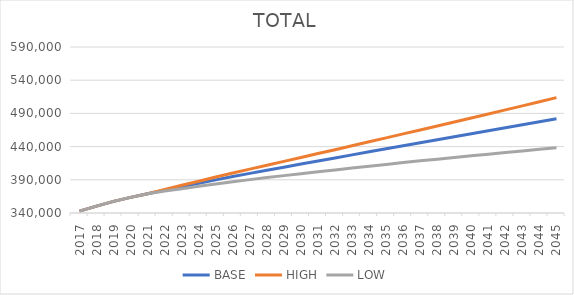
| Category | BASE | HIGH | LOW |
|---|---|---|---|
| 2017.0 | 342817 | 342817 | 342817 |
| 2018.0 | 350430.606 | 350430.606 | 350430.606 |
| 2019.0 | 357512.75 | 357512.75 | 357512.75 |
| 2020.0 | 363512.583 | 363512.583 | 363512.583 |
| 2021.0 | 369033.083 | 369033.083 | 369033.083 |
| 2022.0 | 374436.506 | 375375.352 | 373026.07 |
| 2023.0 | 379632.648 | 381695.858 | 376546.709 |
| 2024.0 | 384800.26 | 387900.744 | 380183.771 |
| 2025.0 | 389922.298 | 394092.029 | 383741.098 |
| 2026.0 | 394925.685 | 400195.278 | 387147.224 |
| 2027.0 | 399676.173 | 406072.957 | 390272.902 |
| 2028.0 | 404364.526 | 411917.847 | 393306.525 |
| 2029.0 | 409025.542 | 417764.901 | 396282.991 |
| 2030.0 | 413651.746 | 423606.247 | 399195.983 |
| 2031.0 | 418277.776 | 429478.027 | 402078.351 |
| 2032.0 | 422901.224 | 435377.965 | 404927.626 |
| 2033.0 | 427508.217 | 441291.797 | 407731.818 |
| 2034.0 | 432104.36 | 447225.663 | 410496.224 |
| 2035.0 | 436681.113 | 453170.724 | 413212.725 |
| 2036.0 | 441247.435 | 459136.302 | 415890.237 |
| 2037.0 | 445798.141 | 465117.142 | 418524.176 |
| 2038.0 | 450331.295 | 471111.256 | 421113.177 |
| 2039.0 | 454854.304 | 477126.651 | 423664.293 |
| 2040.0 | 459353.053 | 483148.037 | 426165.21 |
| 2041.0 | 463843.356 | 489192.639 | 428630.47 |
| 2042.0 | 468328.388 | 495264.581 | 431062.608 |
| 2043.0 | 472826.011 | 501382.993 | 433478.171 |
| 2044.0 | 477323.67 | 507534.865 | 435865.79 |
| 2045.0 | 481904.121 | 513813.689 | 438298.78 |